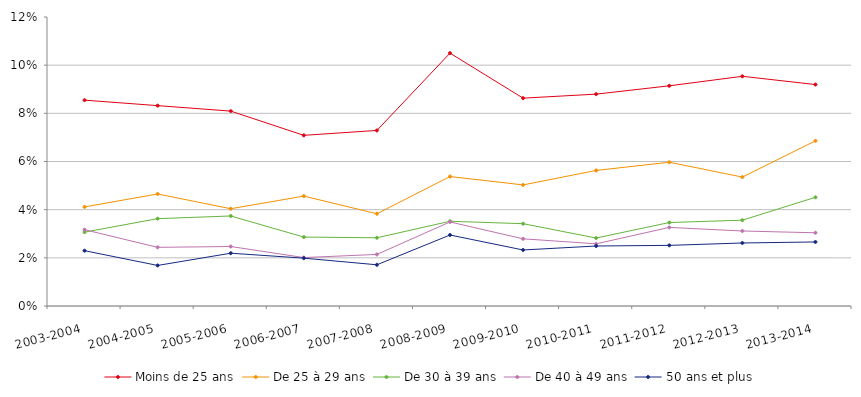
| Category | Moins de 25 ans | De 25 à 29 ans | De 30 à 39 ans | De 40 à 49 ans | 50 ans et plus |
|---|---|---|---|---|---|
| 2003-2004 | 0.085 | 0.041 | 0.031 | 0.032 | 0.023 |
| 2004-2005 | 0.083 | 0.047 | 0.036 | 0.024 | 0.017 |
| 2005-2006 | 0.081 | 0.04 | 0.037 | 0.025 | 0.022 |
| 2006-2007 | 0.071 | 0.046 | 0.029 | 0.02 | 0.02 |
| 2007-2008 | 0.073 | 0.038 | 0.028 | 0.021 | 0.017 |
| 2008-2009 | 0.105 | 0.054 | 0.035 | 0.035 | 0.029 |
| 2009-2010 | 0.086 | 0.05 | 0.034 | 0.028 | 0.023 |
| 2010-2011 | 0.088 | 0.056 | 0.028 | 0.026 | 0.025 |
| 2011-2012 | 0.091 | 0.06 | 0.035 | 0.033 | 0.025 |
| 2012-2013 | 0.095 | 0.054 | 0.036 | 0.031 | 0.026 |
| 2013-2014 | 0.092 | 0.069 | 0.045 | 0.03 | 0.027 |